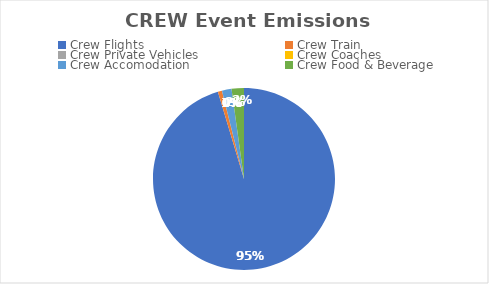
| Category | Series 0 |
|---|---|
| Crew Flights | 3.91 |
| Crew Train | 0.03 |
| Crew Private Vehicles | 0 |
| Crew Coaches | 0 |
| Crew Accomodation | 0.07 |
| Crew Food & Beverage | 0.09 |